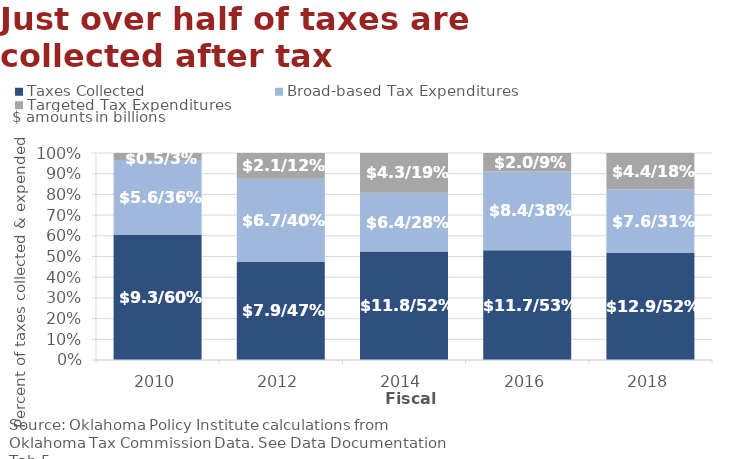
| Category | Taxes Collected | Broad-based Tax Expenditures | Targeted Tax Expenditures |
|---|---|---|---|
| 0 | 0.604 | 0.362 | 0.034 |
| 1 | 0.474 | 0.402 | 0.124 |
| 2 | 0.524 | 0.284 | 0.192 |
| 3 | 0.53 | 0.38 | 0.09 |
| 4 | 0.517 | 0.307 | 0.176 |